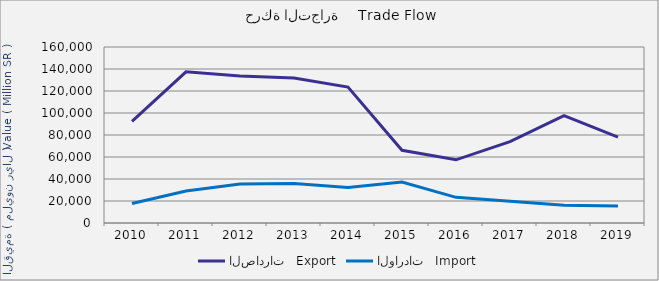
| Category | الصادرات   Export | الواردات   Import |
|---|---|---|
| 2010.0 | 92430869450 | 17788584419 |
| 2011.0 | 137391878487 | 29075665356 |
| 2012.0 | 133585016657 | 35467026666 |
| 2013.0 | 131750081966 | 36017849483 |
| 2014.0 | 123557035145 | 32336134716 |
| 2015.0 | 66099106794 | 37250640608 |
| 2016.0 | 57432484570 | 23327730718 |
| 2017.0 | 74026910780 | 19737891416 |
| 2018.0 | 97592176520 | 16195313653 |
| 2019.0 | 78155019136 | 15504762914 |